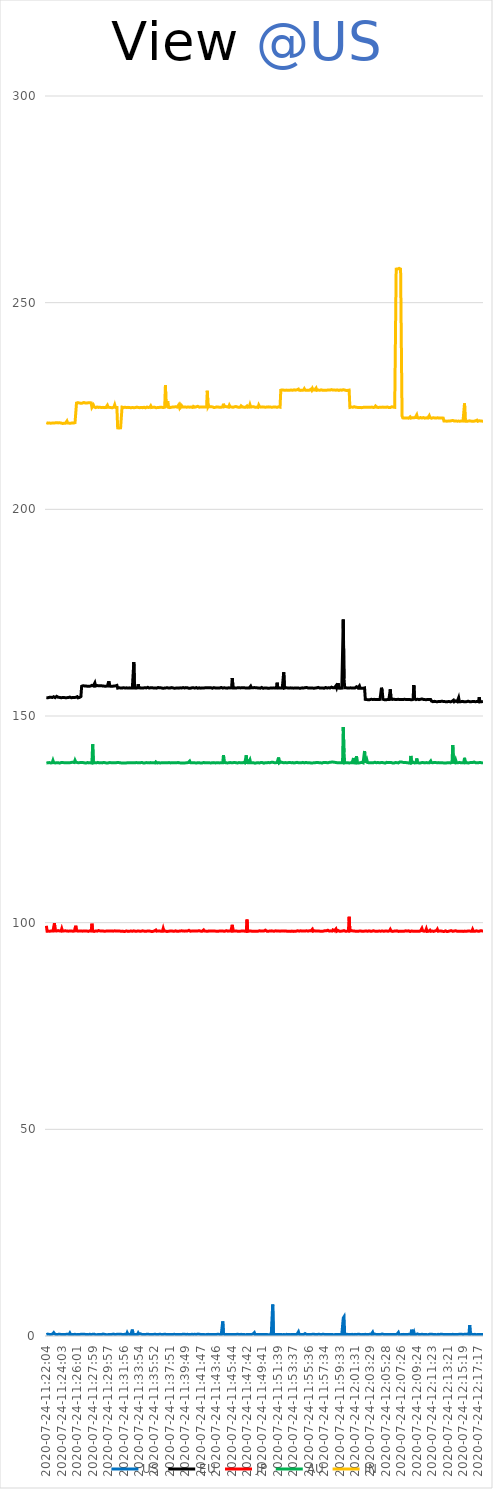
| Category | US | EU | JP | AU | IN |
|---|---|---|---|---|---|
| 2020-07-24-11:22:04 | 0.349 | 154.453 | 99.246 | 138.634 | 220.977 |
| 2020-07-24-11:22:10 | 0.363 | 154.489 | 97.929 | 138.702 | 220.959 |
| 2020-07-24-11:22:16 | 0.46 | 154.418 | 97.937 | 138.682 | 220.846 |
| 2020-07-24-11:22:21 | 0.377 | 154.442 | 97.959 | 138.74 | 220.952 |
| 2020-07-24-11:22:27 | 0.387 | 154.512 | 98.002 | 138.739 | 220.884 |
| 2020-07-24-11:22:33 | 0.388 | 154.384 | 97.931 | 138.747 | 220.794 |
| 2020-07-24-11:22:38 | 0.368 | 154.549 | 98.042 | 138.629 | 220.835 |
| 2020-07-24-11:22:44 | 0.367 | 154.477 | 98.009 | 138.742 | 220.919 |
| 2020-07-24-11:22:49 | 0.422 | 154.471 | 98.019 | 138.701 | 220.879 |
| 2020-07-24-11:22:55 | 0.405 | 154.521 | 97.977 | 139.25 | 220.852 |
| 2020-07-24-11:23:01 | 0.804 | 154.658 | 98.001 | 138.717 | 220.864 |
| 2020-07-24-11:23:06 | 0.53 | 154.465 | 99.886 | 138.709 | 220.865 |
| 2020-07-24-11:23:12 | 0.377 | 154.448 | 98.024 | 138.645 | 220.923 |
| 2020-07-24-11:23:18 | 0.355 | 154.498 | 98.003 | 138.686 | 220.886 |
| 2020-07-24-11:23:23 | 0.393 | 154.749 | 97.991 | 138.7 | 220.935 |
| 2020-07-24-11:23:29 | 0.378 | 154.52 | 97.99 | 138.749 | 220.854 |
| 2020-07-24-11:23:34 | 0.432 | 154.535 | 98.079 | 138.709 | 220.914 |
| 2020-07-24-11:23:40 | 0.405 | 154.465 | 98 | 138.705 | 220.838 |
| 2020-07-24-11:23:46 | 0.399 | 154.496 | 97.999 | 138.609 | 220.935 |
| 2020-07-24-11:23:51 | 0.393 | 154.448 | 98.065 | 138.748 | 221.072 |
| 2020-07-24-11:23:57 | 0.327 | 154.421 | 97.954 | 138.732 | 220.886 |
| 2020-07-24-11:24:03 | 0.354 | 154.458 | 98.548 | 138.692 | 220.937 |
| 2020-07-24-11:24:08 | 0.366 | 154.463 | 97.998 | 138.745 | 220.765 |
| 2020-07-24-11:24:14 | 0.379 | 154.463 | 98.056 | 138.642 | 220.831 |
| 2020-07-24-11:24:19 | 0.408 | 154.455 | 98 | 138.705 | 220.819 |
| 2020-07-24-11:24:25 | 0.355 | 154.453 | 97.985 | 138.658 | 220.846 |
| 2020-07-24-11:24:31 | 0.32 | 154.436 | 98.039 | 138.704 | 220.844 |
| 2020-07-24-11:24:36 | 0.409 | 154.469 | 97.935 | 138.691 | 220.828 |
| 2020-07-24-11:24:42 | 0.335 | 154.441 | 97.963 | 138.696 | 221.373 |
| 2020-07-24-11:24:48 | 0.409 | 154.39 | 97.999 | 138.768 | 220.897 |
| 2020-07-24-11:24:53 | 0.34 | 154.458 | 97.947 | 138.677 | 220.846 |
| 2020-07-24-11:24:59 | 0.376 | 154.435 | 98.024 | 138.733 | 220.841 |
| 2020-07-24-11:25:04 | 0.699 | 154.575 | 97.994 | 138.699 | 220.91 |
| 2020-07-24-11:25:10 | 0.351 | 154.518 | 97.98 | 138.704 | 220.83 |
| 2020-07-24-11:25:16 | 0.341 | 154.422 | 97.987 | 138.774 | 220.953 |
| 2020-07-24-11:25:21 | 0.366 | 154.471 | 97.917 | 138.707 | 220.916 |
| 2020-07-24-11:25:27 | 0.399 | 154.463 | 97.936 | 138.807 | 220.852 |
| 2020-07-24-11:25:33 | 0.358 | 154.501 | 97.966 | 138.764 | 220.875 |
| 2020-07-24-11:25:38 | 0.443 | 154.45 | 97.97 | 138.737 | 220.822 |
| 2020-07-24-11:25:44 | 0.418 | 154.48 | 98.009 | 139.281 | 220.973 |
| 2020-07-24-11:25:50 | 0.344 | 154.525 | 99.256 | 138.882 | 220.877 |
| 2020-07-24-11:25:55 | 0.322 | 154.413 | 98.032 | 138.741 | 225.71 |
| 2020-07-24-11:26:01 | 0.434 | 154.669 | 98.073 | 138.724 | 225.706 |
| 2020-07-24-11:26:06 | 0.365 | 154.4 | 97.946 | 138.676 | 225.809 |
| 2020-07-24-11:26:12 | 0.375 | 154.438 | 97.993 | 138.707 | 225.801 |
| 2020-07-24-11:26:18 | 0.34 | 154.483 | 97.995 | 138.735 | 225.729 |
| 2020-07-24-11:26:23 | 0.319 | 154.467 | 97.976 | 138.728 | 225.726 |
| 2020-07-24-11:26:29 | 0.428 | 154.696 | 97.999 | 138.653 | 225.661 |
| 2020-07-24-11:26:35 | 0.361 | 157.193 | 97.951 | 138.743 | 225.731 |
| 2020-07-24-11:26:40 | 0.404 | 157.238 | 97.947 | 138.779 | 225.696 |
| 2020-07-24-11:26:46 | 0.359 | 157.316 | 97.972 | 138.736 | 225.842 |
| 2020-07-24-11:26:51 | 0.437 | 157.209 | 97.99 | 138.708 | 225.855 |
| 2020-07-24-11:26:57 | 0.328 | 157.273 | 98.024 | 138.66 | 225.696 |
| 2020-07-24-11:27:03 | 0.385 | 157.248 | 97.982 | 138.76 | 225.735 |
| 2020-07-24-11:27:08 | 0.346 | 157.241 | 97.974 | 138.627 | 225.821 |
| 2020-07-24-11:27:14 | 0.385 | 157.196 | 97.995 | 138.844 | 225.707 |
| 2020-07-24-11:27:20 | 0.378 | 157.201 | 97.976 | 138.745 | 225.816 |
| 2020-07-24-11:27:25 | 0.32 | 157.308 | 97.888 | 138.702 | 225.792 |
| 2020-07-24-11:27:31 | 0.402 | 157.174 | 97.987 | 138.66 | 225.793 |
| 2020-07-24-11:27:37 | 0.42 | 157.215 | 98.029 | 138.76 | 225.815 |
| 2020-07-24-11:27:42 | 0.37 | 157.238 | 97.932 | 138.678 | 225.77 |
| 2020-07-24-11:27:48 | 0.342 | 157.349 | 97.974 | 138.694 | 225.754 |
| 2020-07-24-11:27:53 | 0.382 | 157.41 | 99.749 | 138.612 | 224.658 |
| 2020-07-24-11:27:59 | 0.422 | 157.315 | 98.034 | 143.172 | 224.768 |
| 2020-07-24-11:28:05 | 0.39 | 157.271 | 98.058 | 138.718 | 225.225 |
| 2020-07-24-11:28:10 | 0.451 | 157.265 | 97.876 | 138.804 | 224.795 |
| 2020-07-24-11:28:16 | 0.368 | 158.012 | 98.001 | 138.701 | 224.661 |
| 2020-07-24-11:28:22 | 0.306 | 157.251 | 98.002 | 138.746 | 224.615 |
| 2020-07-24-11:28:27 | 0.406 | 157.229 | 98.042 | 138.658 | 224.635 |
| 2020-07-24-11:28:33 | 0.322 | 157.369 | 97.951 | 138.654 | 224.752 |
| 2020-07-24-11:28:39 | 0.412 | 157.295 | 98.035 | 138.774 | 224.677 |
| 2020-07-24-11:28:44 | 0.366 | 157.308 | 98.091 | 138.671 | 224.663 |
| 2020-07-24-11:28:50 | 0.383 | 157.305 | 97.955 | 138.661 | 224.679 |
| 2020-07-24-11:28:55 | 0.366 | 157.34 | 98.009 | 138.719 | 224.682 |
| 2020-07-24-11:29:01 | 0.409 | 157.279 | 97.982 | 138.705 | 224.697 |
| 2020-07-24-11:29:07 | 0.33 | 157.311 | 98.012 | 138.772 | 224.643 |
| 2020-07-24-11:29:12 | 0.336 | 157.206 | 97.999 | 138.655 | 224.625 |
| 2020-07-24-11:29:18 | 0.474 | 157.25 | 97.983 | 138.639 | 224.672 |
| 2020-07-24-11:29:24 | 0.404 | 157.322 | 97.95 | 138.763 | 224.75 |
| 2020-07-24-11:29:29 | 0.4 | 157.225 | 97.908 | 138.656 | 224.606 |
| 2020-07-24-11:29:35 | 0.338 | 157.339 | 98.048 | 138.701 | 224.666 |
| 2020-07-24-11:29:41 | 0.339 | 157.217 | 97.958 | 138.749 | 224.632 |
| 2020-07-24-11:29:46 | 0.31 | 157.34 | 97.95 | 138.614 | 224.608 |
| 2020-07-24-11:29:52 | 0.311 | 157.24 | 97.977 | 138.738 | 225.169 |
| 2020-07-24-11:29:57 | 0.342 | 157.212 | 98.103 | 138.65 | 224.67 |
| 2020-07-24-11:30:03 | 0.381 | 158.392 | 97.988 | 138.743 | 224.778 |
| 2020-07-24-11:30:09 | 0.391 | 157.236 | 98.015 | 138.729 | 224.673 |
| 2020-07-24-11:30:14 | 0.366 | 157.208 | 97.962 | 138.766 | 224.656 |
| 2020-07-24-11:30:20 | 0.361 | 157.195 | 97.872 | 138.714 | 224.612 |
| 2020-07-24-11:30:26 | 0.378 | 157.3 | 97.987 | 138.739 | 224.577 |
| 2020-07-24-11:30:31 | 0.442 | 157.213 | 97.921 | 138.694 | 224.58 |
| 2020-07-24-11:30:37 | 0.461 | 157.31 | 97.944 | 138.836 | 224.632 |
| 2020-07-24-11:30:43 | 0.381 | 157.237 | 97.94 | 138.694 | 224.79 |
| 2020-07-24-11:30:48 | 0.383 | 157.2 | 98.03 | 138.712 | 225.292 |
| 2020-07-24-11:30:54 | 0.368 | 157.294 | 97.93 | 138.661 | 224.662 |
| 2020-07-24-11:30:59 | 0.388 | 157.29 | 97.972 | 138.674 | 224.67 |
| 2020-07-24-11:31:05 | 0.404 | 157.409 | 97.989 | 138.731 | 224.635 |
| 2020-07-24-11:31:11 | 0.444 | 156.751 | 97.964 | 138.698 | 219.707 |
| 2020-07-24-11:31:16 | 0.338 | 156.759 | 97.935 | 138.739 | 219.646 |
| 2020-07-24-11:31:22 | 0.389 | 156.842 | 97.999 | 138.7 | 219.685 |
| 2020-07-24-11:31:28 | 0.365 | 156.773 | 97.939 | 138.703 | 219.825 |
| 2020-07-24-11:31:33 | 0.43 | 156.775 | 97.935 | 138.744 | 219.716 |
| 2020-07-24-11:31:39 | 0.34 | 156.8 | 98.053 | 138.64 | 219.704 |
| 2020-07-24-11:31:44 | 0.373 | 156.753 | 97.953 | 138.678 | 224.728 |
| 2020-07-24-11:31:50 | 0.357 | 156.698 | 97.917 | 138.653 | 224.655 |
| 2020-07-24-11:31:56 | 0.341 | 156.852 | 97.893 | 138.664 | 224.632 |
| 2020-07-24-11:32:01 | 0.423 | 156.821 | 97.94 | 138.652 | 224.714 |
| 2020-07-24-11:32:07 | 0.42 | 156.771 | 97.892 | 138.697 | 224.692 |
| 2020-07-24-11:32:13 | 0.369 | 156.701 | 98 | 138.614 | 224.619 |
| 2020-07-24-11:32:18 | 0.298 | 156.814 | 98.005 | 138.61 | 224.637 |
| 2020-07-24-11:32:24 | 0.785 | 156.777 | 98.212 | 138.695 | 224.609 |
| 2020-07-24-11:32:30 | 0.423 | 156.753 | 97.888 | 138.658 | 224.673 |
| 2020-07-24-11:32:35 | 0.419 | 156.815 | 97.989 | 138.712 | 224.66 |
| 2020-07-24-11:32:41 | 0.375 | 156.808 | 97.93 | 138.684 | 224.639 |
| 2020-07-24-11:32:46 | 0.467 | 156.837 | 97.932 | 138.711 | 224.788 |
| 2020-07-24-11:32:52 | 0.369 | 156.771 | 97.975 | 138.683 | 224.575 |
| 2020-07-24-11:32:58 | 0.337 | 156.73 | 97.852 | 138.697 | 224.673 |
| 2020-07-24-11:33:03 | 1.555 | 156.791 | 97.93 | 138.717 | 224.643 |
| 2020-07-24-11:33:09 | 0.345 | 156.785 | 97.873 | 138.67 | 224.687 |
| 2020-07-24-11:33:15 | 0.366 | 163.042 | 98.018 | 138.664 | 224.591 |
| 2020-07-24-11:33:20 | 0.354 | 156.781 | 97.963 | 138.665 | 224.585 |
| 2020-07-24-11:33:26 | 0.345 | 156.818 | 97.936 | 138.72 | 224.616 |
| 2020-07-24-11:33:32 | 0.37 | 156.734 | 97.96 | 138.727 | 224.786 |
| 2020-07-24-11:33:37 | 0.352 | 156.777 | 97.937 | 138.745 | 224.722 |
| 2020-07-24-11:33:43 | 0.357 | 156.824 | 97.986 | 138.71 | 224.856 |
| 2020-07-24-11:33:48 | 0.74 | 157.667 | 97.988 | 138.673 | 224.652 |
| 2020-07-24-11:33:54 | 0.455 | 156.818 | 98.003 | 138.682 | 224.733 |
| 2020-07-24-11:34:00 | 0.432 | 156.796 | 97.943 | 138.691 | 224.591 |
| 2020-07-24-11:34:05 | 0.526 | 156.788 | 97.888 | 138.703 | 224.623 |
| 2020-07-24-11:34:11 | 0.627 | 156.987 | 97.94 | 138.688 | 224.65 |
| 2020-07-24-11:34:17 | 0.381 | 156.777 | 97.926 | 138.768 | 224.687 |
| 2020-07-24-11:34:22 | 0.364 | 156.765 | 98.026 | 138.696 | 224.596 |
| 2020-07-24-11:34:28 | 0.386 | 156.786 | 97.922 | 138.631 | 224.674 |
| 2020-07-24-11:34:33 | 0.365 | 156.793 | 97.954 | 138.719 | 224.694 |
| 2020-07-24-11:34:39 | 0.348 | 156.832 | 97.857 | 138.65 | 224.655 |
| 2020-07-24-11:34:45 | 0.312 | 156.762 | 97.923 | 138.713 | 224.557 |
| 2020-07-24-11:34:50 | 0.404 | 156.79 | 97.981 | 138.726 | 224.694 |
| 2020-07-24-11:34:56 | 0.372 | 156.795 | 97.957 | 138.689 | 224.754 |
| 2020-07-24-11:35:02 | 0.426 | 156.944 | 97.949 | 138.706 | 224.718 |
| 2020-07-24-11:35:07 | 0.359 | 156.794 | 98 | 138.67 | 224.624 |
| 2020-07-24-11:35:13 | 0.377 | 156.766 | 97.962 | 138.658 | 224.686 |
| 2020-07-24-11:35:19 | 0.371 | 156.741 | 97.948 | 138.736 | 224.721 |
| 2020-07-24-11:35:24 | 0.389 | 156.825 | 97.924 | 138.729 | 225.014 |
| 2020-07-24-11:35:30 | 0.596 | 156.814 | 97.879 | 138.684 | 224.631 |
| 2020-07-24-11:35:35 | 0.355 | 156.832 | 97.908 | 138.666 | 224.715 |
| 2020-07-24-11:35:41 | 0.373 | 156.765 | 97.893 | 138.699 | 224.693 |
| 2020-07-24-11:35:47 | 0.389 | 156.769 | 97.981 | 138.703 | 224.636 |
| 2020-07-24-11:35:52 | 0.413 | 156.803 | 97.997 | 138.762 | 224.724 |
| 2020-07-24-11:35:58 | 0.429 | 156.784 | 97.999 | 138.64 | 224.676 |
| 2020-07-24-11:36:04 | 0.4 | 156.788 | 98.217 | 138.894 | 224.59 |
| 2020-07-24-11:36:09 | 0.333 | 156.745 | 97.95 | 138.666 | 224.716 |
| 2020-07-24-11:36:15 | 0.351 | 156.8 | 97.992 | 138.624 | 224.612 |
| 2020-07-24-11:36:21 | 0.354 | 156.891 | 97.961 | 138.664 | 224.635 |
| 2020-07-24-11:36:26 | 0.345 | 156.905 | 97.973 | 138.717 | 224.641 |
| 2020-07-24-11:36:32 | 0.429 | 156.805 | 98.011 | 138.749 | 224.684 |
| 2020-07-24-11:36:37 | 0.365 | 156.775 | 98.078 | 138.629 | 224.713 |
| 2020-07-24-11:36:43 | 0.394 | 156.806 | 97.914 | 138.656 | 224.753 |
| 2020-07-24-11:36:49 | 0.398 | 156.766 | 97.944 | 138.698 | 224.701 |
| 2020-07-24-11:36:54 | 0.336 | 156.736 | 97.936 | 138.679 | 224.652 |
| 2020-07-24-11:37:00 | 0.363 | 156.79 | 98.587 | 138.672 | 224.62 |
| 2020-07-24-11:37:06 | 0.408 | 156.739 | 97.975 | 138.72 | 224.642 |
| 2020-07-24-11:37:11 | 0.382 | 156.69 | 98.079 | 138.681 | 224.708 |
| 2020-07-24-11:37:17 | 0.409 | 156.793 | 97.992 | 138.644 | 230.01 |
| 2020-07-24-11:37:23 | 0.366 | 156.777 | 97.964 | 138.688 | 224.687 |
| 2020-07-24-11:37:28 | 0.341 | 156.82 | 97.857 | 138.682 | 224.661 |
| 2020-07-24-11:37:34 | 0.33 | 156.79 | 97.954 | 138.673 | 226.184 |
| 2020-07-24-11:37:39 | 0.331 | 156.796 | 97.921 | 138.691 | 224.688 |
| 2020-07-24-11:37:45 | 0.383 | 156.8 | 97.983 | 138.736 | 224.642 |
| 2020-07-24-11:37:51 | 0.374 | 156.755 | 97.97 | 138.749 | 224.614 |
| 2020-07-24-11:37:56 | 0.351 | 156.748 | 97.932 | 138.654 | 224.594 |
| 2020-07-24-11:38:02 | 0.388 | 156.864 | 97.99 | 138.71 | 224.702 |
| 2020-07-24-11:38:08 | 0.315 | 156.759 | 97.918 | 138.67 | 224.755 |
| 2020-07-24-11:38:13 | 0.372 | 156.811 | 97.951 | 138.704 | 224.754 |
| 2020-07-24-11:38:19 | 0.336 | 156.891 | 97.967 | 138.665 | 224.684 |
| 2020-07-24-11:38:24 | 0.406 | 156.721 | 97.932 | 138.595 | 224.776 |
| 2020-07-24-11:38:30 | 0.348 | 156.717 | 97.887 | 138.686 | 224.707 |
| 2020-07-24-11:38:36 | 0.381 | 156.747 | 98.023 | 138.681 | 224.813 |
| 2020-07-24-11:38:41 | 0.381 | 156.771 | 97.992 | 138.662 | 224.728 |
| 2020-07-24-11:38:47 | 0.378 | 156.758 | 97.902 | 138.651 | 224.737 |
| 2020-07-24-11:38:53 | 0.361 | 156.801 | 97.964 | 138.749 | 224.704 |
| 2020-07-24-11:38:58 | 0.355 | 156.741 | 97.937 | 138.692 | 225.24 |
| 2020-07-24-11:39:04 | 0.459 | 156.792 | 97.947 | 138.672 | 224.695 |
| 2020-07-24-11:39:10 | 0.391 | 156.811 | 97.981 | 138.674 | 225.201 |
| 2020-07-24-11:39:15 | 0.353 | 156.812 | 97.899 | 138.641 | 224.79 |
| 2020-07-24-11:39:21 | 0.388 | 156.779 | 98.033 | 138.666 | 225.071 |
| 2020-07-24-11:39:26 | 0.331 | 156.76 | 98.004 | 138.657 | 224.77 |
| 2020-07-24-11:39:32 | 0.401 | 156.879 | 97.987 | 138.754 | 224.879 |
| 2020-07-24-11:39:38 | 0.424 | 156.798 | 97.986 | 138.648 | 224.757 |
| 2020-07-24-11:39:43 | 0.428 | 156.778 | 97.945 | 138.668 | 224.796 |
| 2020-07-24-11:39:49 | 0.436 | 156.788 | 97.97 | 138.653 | 224.755 |
| 2020-07-24-11:39:55 | 0.365 | 156.865 | 98.004 | 138.696 | 224.792 |
| 2020-07-24-11:40:00 | 0.413 | 156.803 | 97.935 | 138.689 | 224.705 |
| 2020-07-24-11:40:06 | 0.418 | 156.828 | 97.989 | 138.741 | 224.725 |
| 2020-07-24-11:40:12 | 0.355 | 156.788 | 97.996 | 138.733 | 224.775 |
| 2020-07-24-11:40:17 | 0.33 | 156.707 | 98.146 | 138.688 | 224.655 |
| 2020-07-24-11:40:23 | 0.393 | 156.794 | 98.03 | 139.097 | 224.711 |
| 2020-07-24-11:40:28 | 0.353 | 156.731 | 97.93 | 138.712 | 224.792 |
| 2020-07-24-11:40:34 | 0.343 | 156.788 | 98.057 | 138.682 | 224.75 |
| 2020-07-24-11:40:40 | 0.407 | 156.81 | 97.969 | 138.667 | 224.706 |
| 2020-07-24-11:40:45 | 0.368 | 156.833 | 97.931 | 138.655 | 224.662 |
| 2020-07-24-11:40:51 | 0.381 | 156.833 | 97.999 | 138.712 | 224.909 |
| 2020-07-24-11:40:57 | 0.387 | 156.841 | 98.059 | 138.747 | 224.692 |
| 2020-07-24-11:41:02 | 0.418 | 156.753 | 97.982 | 138.675 | 224.71 |
| 2020-07-24-11:41:08 | 0.383 | 156.797 | 98.002 | 138.638 | 224.704 |
| 2020-07-24-11:41:14 | 0.349 | 156.871 | 97.989 | 138.619 | 224.813 |
| 2020-07-24-11:41:19 | 0.337 | 156.775 | 97.954 | 138.711 | 224.764 |
| 2020-07-24-11:41:25 | 0.464 | 156.718 | 98.003 | 138.706 | 224.934 |
| 2020-07-24-11:41:30 | 0.347 | 156.758 | 97.962 | 138.706 | 224.864 |
| 2020-07-24-11:41:36 | 0.442 | 156.823 | 98.049 | 138.692 | 224.726 |
| 2020-07-24-11:41:42 | 0.338 | 156.721 | 97.977 | 138.698 | 224.758 |
| 2020-07-24-11:41:47 | 0.354 | 156.737 | 97.952 | 138.628 | 224.729 |
| 2020-07-24-11:41:53 | 0.406 | 156.784 | 98.002 | 138.642 | 224.697 |
| 2020-07-24-11:41:59 | 0.382 | 156.759 | 97.939 | 138.626 | 224.757 |
| 2020-07-24-11:42:04 | 0.36 | 156.815 | 97.91 | 138.7 | 224.704 |
| 2020-07-24-11:42:10 | 0.359 | 156.747 | 98.229 | 138.758 | 224.777 |
| 2020-07-24-11:42:16 | 0.367 | 156.759 | 97.987 | 138.62 | 224.789 |
| 2020-07-24-11:42:21 | 0.322 | 156.831 | 97.97 | 138.672 | 224.753 |
| 2020-07-24-11:42:27 | 0.347 | 156.731 | 97.951 | 138.643 | 224.72 |
| 2020-07-24-11:42:32 | 0.347 | 156.838 | 97.963 | 138.702 | 224.8 |
| 2020-07-24-11:42:38 | 0.439 | 156.764 | 97.901 | 138.715 | 228.686 |
| 2020-07-24-11:42:44 | 0.402 | 156.819 | 97.931 | 138.695 | 224.779 |
| 2020-07-24-11:42:49 | 0.41 | 156.775 | 97.985 | 138.713 | 225.077 |
| 2020-07-24-11:42:55 | 0.346 | 156.842 | 97.922 | 138.67 | 224.797 |
| 2020-07-24-11:43:01 | 0.35 | 156.79 | 97.963 | 138.703 | 224.734 |
| 2020-07-24-11:43:06 | 0.388 | 156.827 | 97.916 | 138.637 | 224.8 |
| 2020-07-24-11:43:12 | 0.3 | 156.803 | 97.99 | 138.736 | 224.802 |
| 2020-07-24-11:43:17 | 0.341 | 156.727 | 97.924 | 138.707 | 224.787 |
| 2020-07-24-11:43:23 | 0.341 | 156.88 | 97.957 | 138.723 | 224.676 |
| 2020-07-24-11:43:29 | 0.383 | 156.858 | 97.942 | 138.72 | 224.641 |
| 2020-07-24-11:43:34 | 0.379 | 156.733 | 97.968 | 138.715 | 224.696 |
| 2020-07-24-11:43:40 | 0.358 | 156.784 | 97.946 | 138.642 | 224.676 |
| 2020-07-24-11:43:46 | 0.379 | 156.802 | 97.944 | 138.669 | 224.808 |
| 2020-07-24-11:43:51 | 0.393 | 156.773 | 97.968 | 138.689 | 224.788 |
| 2020-07-24-11:43:57 | 0.323 | 156.82 | 97.938 | 138.661 | 224.731 |
| 2020-07-24-11:44:03 | 0.4 | 156.757 | 97.923 | 138.685 | 224.74 |
| 2020-07-24-11:44:08 | 0.357 | 156.784 | 97.955 | 138.666 | 224.675 |
| 2020-07-24-11:44:14 | 0.386 | 156.788 | 97.956 | 138.652 | 224.689 |
| 2020-07-24-11:44:19 | 0.347 | 156.981 | 97.989 | 138.684 | 224.693 |
| 2020-07-24-11:44:25 | 0.368 | 156.903 | 97.972 | 138.699 | 224.706 |
| 2020-07-24-11:44:31 | 0.364 | 156.793 | 98.001 | 138.672 | 224.818 |
| 2020-07-24-11:44:36 | 3.532 | 156.751 | 97.986 | 138.7 | 224.801 |
| 2020-07-24-11:44:42 | 0.448 | 156.801 | 97.952 | 140.533 | 225.539 |
| 2020-07-24-11:44:48 | 0.381 | 156.838 | 97.963 | 138.731 | 224.81 |
| 2020-07-24-11:44:53 | 0.341 | 156.719 | 97.941 | 138.664 | 224.705 |
| 2020-07-24-11:44:59 | 0.356 | 156.761 | 98.033 | 138.699 | 224.869 |
| 2020-07-24-11:45:05 | 0.393 | 156.778 | 98.059 | 138.656 | 225.088 |
| 2020-07-24-11:45:10 | 0.401 | 156.738 | 98.03 | 138.653 | 224.808 |
| 2020-07-24-11:45:16 | 0.337 | 156.708 | 97.947 | 138.705 | 224.759 |
| 2020-07-24-11:45:21 | 0.452 | 156.821 | 97.885 | 138.664 | 224.71 |
| 2020-07-24-11:45:27 | 0.351 | 156.744 | 97.997 | 138.686 | 225.17 |
| 2020-07-24-11:45:33 | 0.344 | 156.791 | 98 | 138.739 | 224.804 |
| 2020-07-24-11:45:38 | 0.343 | 156.771 | 97.963 | 138.597 | 224.625 |
| 2020-07-24-11:45:44 | 0.309 | 156.846 | 97.985 | 138.689 | 224.774 |
| 2020-07-24-11:45:50 | 0.333 | 159.193 | 99.483 | 138.652 | 224.783 |
| 2020-07-24-11:45:55 | 0.349 | 156.797 | 97.939 | 138.709 | 224.686 |
| 2020-07-24-11:46:01 | 0.364 | 156.791 | 97.993 | 138.846 | 224.83 |
| 2020-07-24-11:46:07 | 0.35 | 156.781 | 97.996 | 138.752 | 224.818 |
| 2020-07-24-11:46:12 | 0.336 | 156.798 | 97.95 | 138.768 | 224.7 |
| 2020-07-24-11:46:18 | 0.359 | 156.795 | 97.976 | 138.693 | 224.868 |
| 2020-07-24-11:46:23 | 0.4 | 156.824 | 98.048 | 138.709 | 224.857 |
| 2020-07-24-11:46:29 | 0.348 | 156.809 | 97.946 | 138.633 | 224.752 |
| 2020-07-24-11:46:35 | 0.397 | 156.804 | 98.005 | 138.694 | 224.709 |
| 2020-07-24-11:46:40 | 0.392 | 156.826 | 97.897 | 138.728 | 224.673 |
| 2020-07-24-11:46:46 | 0.361 | 156.797 | 97.991 | 138.715 | 224.743 |
| 2020-07-24-11:46:52 | 0.364 | 156.795 | 97.95 | 138.708 | 224.726 |
| 2020-07-24-11:46:57 | 0.401 | 156.751 | 98.007 | 138.771 | 225.031 |
| 2020-07-24-11:47:03 | 0.401 | 156.849 | 97.964 | 138.687 | 224.88 |
| 2020-07-24-11:47:08 | 0.336 | 156.739 | 97.952 | 138.671 | 224.74 |
| 2020-07-24-11:47:14 | 0.302 | 156.808 | 97.981 | 138.736 | 224.721 |
| 2020-07-24-11:47:20 | 0.347 | 156.765 | 97.968 | 138.706 | 224.722 |
| 2020-07-24-11:47:25 | 0.372 | 156.809 | 97.945 | 138.64 | 224.795 |
| 2020-07-24-11:47:31 | 0.325 | 156.87 | 97.979 | 138.658 | 224.701 |
| 2020-07-24-11:47:37 | 0.456 | 156.762 | 97.889 | 140.486 | 224.727 |
| 2020-07-24-11:47:42 | 0.344 | 156.779 | 100.755 | 138.721 | 224.999 |
| 2020-07-24-11:47:48 | 0.381 | 156.801 | 97.937 | 138.749 | 224.716 |
| 2020-07-24-11:47:54 | 0.371 | 156.72 | 97.952 | 138.693 | 224.711 |
| 2020-07-24-11:47:59 | 0.361 | 156.765 | 97.953 | 138.713 | 224.749 |
| 2020-07-24-11:48:05 | 0.343 | 156.81 | 97.981 | 139.41 | 225.316 |
| 2020-07-24-11:48:10 | 0.394 | 157.218 | 97.99 | 138.686 | 224.749 |
| 2020-07-24-11:48:16 | 0.359 | 156.813 | 97.976 | 138.693 | 224.787 |
| 2020-07-24-11:48:22 | 0.36 | 156.781 | 97.912 | 138.683 | 224.794 |
| 2020-07-24-11:48:27 | 0.466 | 156.844 | 97.993 | 138.727 | 224.751 |
| 2020-07-24-11:48:33 | 0.417 | 156.807 | 97.942 | 138.679 | 224.83 |
| 2020-07-24-11:48:39 | 0.801 | 156.874 | 97.989 | 138.729 | 224.702 |
| 2020-07-24-11:48:44 | 0.349 | 156.732 | 97.929 | 138.579 | 224.695 |
| 2020-07-24-11:48:50 | 0.349 | 156.819 | 97.98 | 138.69 | 224.695 |
| 2020-07-24-11:48:56 | 0.351 | 156.733 | 97.92 | 138.668 | 224.735 |
| 2020-07-24-11:49:01 | 0.429 | 156.807 | 97.953 | 138.673 | 224.768 |
| 2020-07-24-11:49:07 | 0.36 | 156.784 | 97.932 | 138.698 | 224.658 |
| 2020-07-24-11:49:12 | 0.384 | 156.775 | 97.992 | 138.644 | 225.222 |
| 2020-07-24-11:49:18 | 0.335 | 156.787 | 98.032 | 138.63 | 224.869 |
| 2020-07-24-11:49:24 | 0.328 | 156.728 | 97.927 | 138.757 | 224.759 |
| 2020-07-24-11:49:29 | 0.336 | 156.746 | 97.99 | 138.769 | 224.726 |
| 2020-07-24-11:49:35 | 0.307 | 156.913 | 97.948 | 138.727 | 224.692 |
| 2020-07-24-11:49:41 | 0.375 | 156.764 | 97.955 | 138.726 | 224.789 |
| 2020-07-24-11:49:46 | 0.363 | 156.708 | 98.006 | 138.718 | 224.716 |
| 2020-07-24-11:49:52 | 0.371 | 156.813 | 97.975 | 138.58 | 224.768 |
| 2020-07-24-11:49:58 | 0.426 | 156.785 | 97.95 | 138.715 | 224.822 |
| 2020-07-24-11:50:03 | 0.383 | 156.933 | 98.185 | 138.699 | 224.693 |
| 2020-07-24-11:50:09 | 0.371 | 156.76 | 97.976 | 138.675 | 224.699 |
| 2020-07-24-11:50:14 | 0.357 | 156.783 | 97.938 | 138.692 | 224.756 |
| 2020-07-24-11:50:20 | 0.401 | 156.74 | 98.022 | 138.694 | 224.777 |
| 2020-07-24-11:50:26 | 0.312 | 156.685 | 97.941 | 138.75 | 224.791 |
| 2020-07-24-11:50:31 | 0.366 | 156.721 | 97.96 | 138.703 | 224.738 |
| 2020-07-24-11:50:37 | 0.338 | 156.771 | 97.966 | 138.685 | 224.742 |
| 2020-07-24-11:50:43 | 0.315 | 156.767 | 97.972 | 138.723 | 224.804 |
| 2020-07-24-11:50:48 | 0.34 | 156.739 | 98.016 | 138.785 | 224.724 |
| 2020-07-24-11:50:54 | 0.291 | 156.79 | 97.952 | 138.711 | 224.807 |
| 2020-07-24-11:51:00 | 7.626 | 156.85 | 97.967 | 138.82 | 224.726 |
| 2020-07-24-11:51:05 | 0.37 | 156.806 | 97.974 | 138.705 | 224.837 |
| 2020-07-24-11:51:11 | 0.345 | 156.745 | 97.929 | 138.716 | 224.778 |
| 2020-07-24-11:51:16 | 0.353 | 156.751 | 97.936 | 138.736 | 224.72 |
| 2020-07-24-11:51:22 | 0.329 | 156.859 | 98.03 | 138.69 | 224.754 |
| 2020-07-24-11:51:28 | 0.363 | 156.818 | 97.943 | 138.746 | 224.779 |
| 2020-07-24-11:51:33 | 0.39 | 158.056 | 97.971 | 138.752 | 224.685 |
| 2020-07-24-11:51:39 | 0.382 | 156.79 | 97.987 | 138.68 | 224.84 |
| 2020-07-24-11:51:45 | 0.383 | 156.793 | 97.98 | 139.958 | 224.809 |
| 2020-07-24-11:51:50 | 0.333 | 156.78 | 97.911 | 138.649 | 224.789 |
| 2020-07-24-11:51:56 | 0.374 | 156.793 | 97.943 | 138.635 | 224.722 |
| 2020-07-24-11:52:02 | 0.378 | 156.747 | 97.953 | 138.89 | 228.815 |
| 2020-07-24-11:52:07 | 0.349 | 156.749 | 97.992 | 138.723 | 228.827 |
| 2020-07-24-11:52:13 | 0.309 | 156.765 | 97.971 | 138.758 | 228.896 |
| 2020-07-24-11:52:18 | 0.347 | 156.739 | 98.01 | 138.729 | 228.801 |
| 2020-07-24-11:52:24 | 0.372 | 160.585 | 97.926 | 138.682 | 228.831 |
| 2020-07-24-11:52:30 | 0.344 | 156.75 | 97.953 | 138.693 | 228.899 |
| 2020-07-24-11:52:35 | 0.295 | 156.75 | 97.917 | 138.736 | 228.799 |
| 2020-07-24-11:52:41 | 0.348 | 156.835 | 97.983 | 138.726 | 228.817 |
| 2020-07-24-11:52:47 | 0.4 | 156.754 | 98.047 | 138.672 | 228.845 |
| 2020-07-24-11:52:52 | 0.364 | 156.801 | 97.904 | 138.687 | 228.815 |
| 2020-07-24-11:52:58 | 0.362 | 156.836 | 98.002 | 138.718 | 228.819 |
| 2020-07-24-11:53:04 | 0.577 | 156.798 | 97.937 | 138.664 | 228.861 |
| 2020-07-24-11:53:09 | 0.349 | 156.727 | 97.908 | 138.757 | 228.812 |
| 2020-07-24-11:53:15 | 0.349 | 156.806 | 97.891 | 138.687 | 228.809 |
| 2020-07-24-11:53:20 | 0.328 | 156.852 | 98.023 | 138.708 | 228.866 |
| 2020-07-24-11:53:26 | 0.416 | 156.765 | 97.964 | 138.641 | 228.753 |
| 2020-07-24-11:53:32 | 0.38 | 156.796 | 97.944 | 138.724 | 228.807 |
| 2020-07-24-11:53:37 | 0.384 | 156.738 | 97.887 | 138.694 | 228.753 |
| 2020-07-24-11:53:43 | 0.335 | 156.768 | 97.909 | 138.643 | 228.912 |
| 2020-07-24-11:53:49 | 0.371 | 156.772 | 97.936 | 138.696 | 228.921 |
| 2020-07-24-11:53:54 | 0.361 | 156.715 | 97.924 | 138.708 | 228.838 |
| 2020-07-24-11:54:00 | 0.371 | 156.781 | 97.949 | 138.704 | 228.91 |
| 2020-07-24-11:54:06 | 0.387 | 156.849 | 97.94 | 138.779 | 228.916 |
| 2020-07-24-11:54:11 | 0.387 | 156.768 | 98.044 | 138.726 | 228.8 |
| 2020-07-24-11:54:17 | 0.997 | 156.751 | 97.946 | 138.69 | 229.1 |
| 2020-07-24-11:54:22 | 0.389 | 156.74 | 97.948 | 138.625 | 228.826 |
| 2020-07-24-11:54:28 | 0.333 | 156.825 | 97.931 | 138.67 | 228.827 |
| 2020-07-24-11:54:34 | 0.365 | 156.735 | 98.029 | 138.738 | 228.778 |
| 2020-07-24-11:54:39 | 0.38 | 156.772 | 97.978 | 138.672 | 228.894 |
| 2020-07-24-11:54:45 | 0.378 | 156.808 | 97.985 | 138.661 | 228.791 |
| 2020-07-24-11:54:51 | 0.373 | 156.749 | 97.909 | 138.776 | 228.839 |
| 2020-07-24-11:54:56 | 0.312 | 156.784 | 98.005 | 138.641 | 228.851 |
| 2020-07-24-11:55:02 | 0.417 | 156.831 | 97.982 | 138.661 | 229.166 |
| 2020-07-24-11:55:08 | 0.578 | 156.835 | 97.973 | 138.778 | 228.841 |
| 2020-07-24-11:55:13 | 0.387 | 156.793 | 97.915 | 138.751 | 228.834 |
| 2020-07-24-11:55:19 | 0.383 | 156.902 | 98.036 | 138.765 | 228.799 |
| 2020-07-24-11:55:24 | 0.377 | 156.73 | 97.994 | 138.705 | 228.872 |
| 2020-07-24-11:55:30 | 0.375 | 156.776 | 97.949 | 138.649 | 228.806 |
| 2020-07-24-11:55:36 | 0.338 | 156.782 | 98.034 | 138.69 | 228.869 |
| 2020-07-24-11:55:41 | 0.339 | 156.782 | 98.051 | 138.706 | 228.835 |
| 2020-07-24-11:55:47 | 0.359 | 156.788 | 98.018 | 138.663 | 228.864 |
| 2020-07-24-11:55:53 | 0.385 | 156.755 | 98.01 | 138.668 | 229.066 |
| 2020-07-24-11:55:58 | 0.359 | 156.747 | 98.013 | 138.629 | 228.796 |
| 2020-07-24-11:56:04 | 0.398 | 156.783 | 98.412 | 138.625 | 229.227 |
| 2020-07-24-11:56:10 | 0.359 | 156.762 | 97.932 | 138.661 | 228.844 |
| 2020-07-24-11:56:15 | 0.433 | 156.704 | 97.915 | 138.767 | 229.033 |
| 2020-07-24-11:56:21 | 0.418 | 156.724 | 98.047 | 138.669 | 228.877 |
| 2020-07-24-11:56:27 | 0.332 | 156.779 | 97.954 | 138.643 | 228.886 |
| 2020-07-24-11:56:32 | 0.392 | 156.74 | 97.958 | 138.737 | 229.328 |
| 2020-07-24-11:56:38 | 0.351 | 156.812 | 97.906 | 138.676 | 228.792 |
| 2020-07-24-11:56:43 | 0.344 | 156.831 | 98.002 | 138.758 | 228.804 |
| 2020-07-24-11:56:49 | 0.413 | 156.916 | 97.949 | 138.632 | 228.872 |
| 2020-07-24-11:56:55 | 0.373 | 156.778 | 97.974 | 138.704 | 228.854 |
| 2020-07-24-11:57:00 | 0.392 | 156.76 | 98.011 | 138.715 | 228.8 |
| 2020-07-24-11:57:06 | 0.376 | 156.806 | 97.927 | 138.698 | 228.754 |
| 2020-07-24-11:57:12 | 0.344 | 156.756 | 97.997 | 138.826 | 228.912 |
| 2020-07-24-11:57:17 | 0.346 | 156.745 | 97.904 | 138.606 | 228.919 |
| 2020-07-24-11:57:23 | 0.423 | 156.788 | 98.049 | 138.662 | 228.81 |
| 2020-07-24-11:57:29 | 0.388 | 156.773 | 97.959 | 138.763 | 228.86 |
| 2020-07-24-11:57:34 | 0.395 | 156.706 | 97.874 | 138.666 | 228.793 |
| 2020-07-24-11:57:40 | 0.496 | 156.846 | 98.062 | 138.726 | 228.849 |
| 2020-07-24-11:57:45 | 0.367 | 156.89 | 97.975 | 138.76 | 228.782 |
| 2020-07-24-11:57:51 | 0.381 | 156.863 | 98.021 | 138.726 | 228.78 |
| 2020-07-24-11:57:57 | 0.346 | 156.775 | 97.883 | 138.754 | 228.836 |
| 2020-07-24-11:58:02 | 0.508 | 156.763 | 98.173 | 138.675 | 228.832 |
| 2020-07-24-11:58:08 | 0.354 | 156.833 | 97.985 | 138.733 | 228.896 |
| 2020-07-24-11:58:14 | 0.365 | 156.811 | 97.963 | 138.776 | 228.935 |
| 2020-07-24-11:58:19 | 0.347 | 156.773 | 97.994 | 138.785 | 228.85 |
| 2020-07-24-11:58:25 | 0.375 | 156.77 | 98.022 | 138.824 | 228.818 |
| 2020-07-24-11:58:31 | 0.387 | 156.983 | 97.921 | 138.726 | 228.96 |
| 2020-07-24-11:58:36 | 0.363 | 156.826 | 97.968 | 138.864 | 228.833 |
| 2020-07-24-11:58:42 | 0.33 | 156.827 | 98.252 | 138.753 | 228.852 |
| 2020-07-24-11:58:47 | 0.359 | 156.834 | 98.15 | 138.832 | 228.841 |
| 2020-07-24-11:58:53 | 0.332 | 156.831 | 98.036 | 138.775 | 228.885 |
| 2020-07-24-11:58:59 | 0.293 | 156.926 | 97.943 | 138.777 | 228.806 |
| 2020-07-24-11:59:04 | 0.362 | 157.294 | 98.471 | 138.779 | 228.822 |
| 2020-07-24-11:59:10 | 0.375 | 156.799 | 97.908 | 138.718 | 228.861 |
| 2020-07-24-11:59:16 | 0.38 | 156.707 | 97.928 | 138.757 | 228.897 |
| 2020-07-24-11:59:21 | 0.431 | 157.929 | 98.117 | 138.661 | 228.87 |
| 2020-07-24-11:59:27 | 0.344 | 156.77 | 97.94 | 138.647 | 228.764 |
| 2020-07-24-11:59:33 | 0.447 | 156.943 | 97.933 | 138.694 | 228.821 |
| 2020-07-24-11:59:38 | 0.361 | 156.731 | 97.953 | 138.717 | 228.886 |
| 2020-07-24-11:59:44 | 0.346 | 156.733 | 97.941 | 138.705 | 228.788 |
| 2020-07-24-11:59:50 | 0.371 | 156.75 | 97.969 | 138.674 | 228.822 |
| 2020-07-24-11:59:55 | 0.376 | 156.841 | 97.982 | 138.708 | 228.737 |
| 2020-07-24-12:00:01 | 4.347 | 173.355 | 97.99 | 147.325 | 228.94 |
| 2020-07-24-12:00:06 | 4.634 | 159.072 | 98.079 | 141.191 | 228.846 |
| 2020-07-24-12:00:12 | 0.353 | 156.837 | 98.001 | 138.65 | 228.862 |
| 2020-07-24-12:00:18 | 0.341 | 156.824 | 97.924 | 138.696 | 228.833 |
| 2020-07-24-12:00:23 | 0.362 | 156.821 | 97.889 | 138.717 | 228.763 |
| 2020-07-24-12:00:29 | 0.311 | 156.768 | 97.952 | 138.663 | 228.767 |
| 2020-07-24-12:00:35 | 0.398 | 156.755 | 97.953 | 138.69 | 228.778 |
| 2020-07-24-12:00:40 | 0.362 | 156.752 | 97.964 | 138.661 | 228.786 |
| 2020-07-24-12:00:46 | 0.334 | 156.779 | 101.431 | 138.64 | 228.845 |
| 2020-07-24-12:00:52 | 0.319 | 156.757 | 97.981 | 138.657 | 224.661 |
| 2020-07-24-12:00:57 | 0.363 | 156.81 | 98.009 | 138.679 | 224.696 |
| 2020-07-24-12:01:03 | 0.402 | 156.925 | 98.087 | 138.71 | 224.761 |
| 2020-07-24-12:01:09 | 0.403 | 156.787 | 97.974 | 138.683 | 224.812 |
| 2020-07-24-12:01:14 | 0.356 | 156.835 | 98.003 | 138.695 | 224.695 |
| 2020-07-24-12:01:20 | 0.311 | 156.783 | 97.966 | 139.841 | 224.669 |
| 2020-07-24-12:01:25 | 0.327 | 156.713 | 97.983 | 138.659 | 224.824 |
| 2020-07-24-12:01:31 | 0.398 | 156.791 | 97.983 | 138.654 | 224.586 |
| 2020-07-24-12:01:37 | 0.341 | 156.792 | 97.904 | 138.647 | 224.712 |
| 2020-07-24-12:01:42 | 0.369 | 157.068 | 98.037 | 140.307 | 224.64 |
| 2020-07-24-12:01:48 | 0.374 | 156.831 | 97.952 | 138.663 | 224.668 |
| 2020-07-24-12:01:54 | 0.41 | 156.78 | 98.035 | 138.726 | 224.659 |
| 2020-07-24-12:01:59 | 0.315 | 156.758 | 97.946 | 138.624 | 224.627 |
| 2020-07-24-12:02:05 | 0.399 | 157.283 | 98.023 | 138.694 | 224.678 |
| 2020-07-24-12:02:10 | 0.347 | 156.737 | 97.989 | 138.69 | 224.647 |
| 2020-07-24-12:02:16 | 0.327 | 156.759 | 97.956 | 138.649 | 224.656 |
| 2020-07-24-12:02:22 | 0.393 | 156.737 | 97.944 | 138.789 | 224.594 |
| 2020-07-24-12:02:27 | 0.352 | 156.749 | 97.943 | 138.693 | 224.659 |
| 2020-07-24-12:02:33 | 0.333 | 156.712 | 97.935 | 138.669 | 224.67 |
| 2020-07-24-12:02:39 | 0.33 | 156.73 | 97.99 | 138.655 | 224.732 |
| 2020-07-24-12:02:44 | 0.328 | 156.798 | 97.953 | 141.536 | 224.67 |
| 2020-07-24-12:02:50 | 0.413 | 154.022 | 97.985 | 138.658 | 224.603 |
| 2020-07-24-12:02:56 | 0.335 | 153.956 | 97.996 | 138.716 | 224.669 |
| 2020-07-24-12:03:01 | 0.332 | 153.968 | 97.963 | 139.454 | 224.694 |
| 2020-07-24-12:03:07 | 0.397 | 153.971 | 97.919 | 138.763 | 224.681 |
| 2020-07-24-12:03:12 | 0.366 | 153.946 | 97.988 | 138.704 | 224.659 |
| 2020-07-24-12:03:18 | 0.357 | 153.978 | 98.018 | 138.665 | 224.718 |
| 2020-07-24-12:03:24 | 0.416 | 153.95 | 97.923 | 138.682 | 224.566 |
| 2020-07-24-12:03:29 | 0.326 | 154.095 | 97.944 | 138.71 | 224.706 |
| 2020-07-24-12:03:35 | 0.382 | 154.039 | 98.069 | 138.729 | 224.788 |
| 2020-07-24-12:03:41 | 0.412 | 154.215 | 97.938 | 138.694 | 224.737 |
| 2020-07-24-12:03:46 | 0.908 | 154.009 | 97.97 | 138.745 | 224.675 |
| 2020-07-24-12:03:52 | 0.397 | 154.042 | 98.044 | 138.687 | 224.635 |
| 2020-07-24-12:03:58 | 0.443 | 154.026 | 97.94 | 138.693 | 224.669 |
| 2020-07-24-12:04:03 | 0.449 | 154.13 | 97.953 | 138.815 | 224.714 |
| 2020-07-24-12:04:09 | 0.368 | 153.996 | 97.981 | 138.754 | 225.002 |
| 2020-07-24-12:04:14 | 0.373 | 154.07 | 97.919 | 138.69 | 224.871 |
| 2020-07-24-12:04:20 | 0.392 | 154.017 | 97.913 | 138.731 | 224.674 |
| 2020-07-24-12:04:26 | 0.331 | 154.059 | 97.936 | 138.744 | 224.701 |
| 2020-07-24-12:04:31 | 0.346 | 153.99 | 97.939 | 138.751 | 224.654 |
| 2020-07-24-12:04:37 | 0.357 | 154.009 | 97.97 | 138.694 | 224.605 |
| 2020-07-24-12:04:43 | 0.337 | 154.02 | 98.02 | 138.65 | 224.724 |
| 2020-07-24-12:04:48 | 0.364 | 153.964 | 97.936 | 138.722 | 224.605 |
| 2020-07-24-12:04:54 | 0.354 | 156.842 | 97.923 | 138.707 | 224.704 |
| 2020-07-24-12:04:59 | 0.485 | 156.05 | 98.006 | 138.753 | 224.671 |
| 2020-07-24-12:05:05 | 0.388 | 154.043 | 98.024 | 138.692 | 224.733 |
| 2020-07-24-12:05:11 | 0.375 | 154.025 | 97.922 | 138.684 | 224.684 |
| 2020-07-24-12:05:16 | 0.439 | 153.942 | 97.941 | 138.667 | 224.67 |
| 2020-07-24-12:05:22 | 0.342 | 153.988 | 97.975 | 138.61 | 224.702 |
| 2020-07-24-12:05:28 | 0.416 | 153.959 | 97.918 | 138.708 | 224.674 |
| 2020-07-24-12:05:33 | 0.361 | 153.953 | 97.998 | 138.785 | 224.765 |
| 2020-07-24-12:05:39 | 0.336 | 153.962 | 97.942 | 138.66 | 224.766 |
| 2020-07-24-12:05:45 | 0.374 | 153.933 | 97.909 | 138.722 | 224.708 |
| 2020-07-24-12:05:50 | 0.312 | 153.97 | 97.967 | 138.669 | 224.623 |
| 2020-07-24-12:05:56 | 0.376 | 154.068 | 98.04 | 138.773 | 224.74 |
| 2020-07-24-12:06:01 | 0.442 | 156.443 | 98.354 | 138.667 | 224.636 |
| 2020-07-24-12:06:07 | 0.348 | 154.036 | 97.993 | 138.759 | 224.671 |
| 2020-07-24-12:06:13 | 0.359 | 154.03 | 97.914 | 138.677 | 224.822 |
| 2020-07-24-12:06:18 | 0.374 | 154.017 | 97.888 | 138.641 | 224.624 |
| 2020-07-24-12:06:24 | 0.345 | 153.961 | 97.917 | 138.648 | 224.731 |
| 2020-07-24-12:06:30 | 0.367 | 154.061 | 97.951 | 138.616 | 224.742 |
| 2020-07-24-12:06:35 | 0.344 | 153.97 | 97.983 | 138.764 | 224.677 |
| 2020-07-24-12:06:41 | 0.386 | 153.968 | 97.977 | 138.748 | 224.8 |
| 2020-07-24-12:06:46 | 0.324 | 153.958 | 98.022 | 138.665 | 258.115 |
| 2020-07-24-12:06:52 | 0.394 | 154.016 | 98.024 | 138.707 | 258.175 |
| 2020-07-24-12:06:58 | 0.399 | 154.003 | 97.944 | 138.735 | 258.141 |
| 2020-07-24-12:07:03 | 0.852 | 154.029 | 97.887 | 138.646 | 258.196 |
| 2020-07-24-12:07:09 | 0.352 | 153.985 | 98.05 | 138.753 | 258.292 |
| 2020-07-24-12:07:15 | 0.408 | 153.978 | 97.948 | 138.89 | 258.103 |
| 2020-07-24-12:07:20 | 0.321 | 153.923 | 98.011 | 138.742 | 258.138 |
| 2020-07-24-12:07:26 | 0.42 | 153.994 | 97.936 | 138.885 | 258.149 |
| 2020-07-24-12:07:32 | 0.371 | 154.067 | 98.036 | 138.81 | 222.599 |
| 2020-07-24-12:07:37 | 0.337 | 153.967 | 97.925 | 138.786 | 222.121 |
| 2020-07-24-12:07:43 | 0.394 | 154.001 | 97.974 | 138.8 | 222.144 |
| 2020-07-24-12:07:49 | 0.36 | 154.037 | 97.935 | 138.739 | 222.098 |
| 2020-07-24-12:07:54 | 0.376 | 153.996 | 97.997 | 138.791 | 222.112 |
| 2020-07-24-12:08:00 | 0.389 | 154.014 | 98.026 | 138.733 | 222.066 |
| 2020-07-24-12:08:06 | 0.371 | 154 | 97.935 | 138.751 | 222.124 |
| 2020-07-24-12:08:11 | 0.401 | 154.001 | 97.985 | 138.703 | 222.088 |
| 2020-07-24-12:08:17 | 0.375 | 153.945 | 98.015 | 138.79 | 222.072 |
| 2020-07-24-12:08:22 | 0.351 | 153.99 | 98.02 | 138.64 | 222.053 |
| 2020-07-24-12:08:28 | 0.435 | 154.172 | 98.062 | 138.71 | 222.09 |
| 2020-07-24-12:08:34 | 0.365 | 153.966 | 97.871 | 138.649 | 222.37 |
| 2020-07-24-12:08:39 | 0.325 | 153.916 | 97.985 | 140.335 | 222.068 |
| 2020-07-24-12:08:45 | 1.526 | 153.923 | 97.984 | 138.664 | 222.086 |
| 2020-07-24-12:08:51 | 0.415 | 154.002 | 98.012 | 138.647 | 222.157 |
| 2020-07-24-12:08:56 | 0.402 | 154.002 | 97.929 | 138.835 | 222.159 |
| 2020-07-24-12:09:02 | 1.027 | 157.506 | 97.98 | 138.693 | 222.154 |
| 2020-07-24-12:09:07 | 0.297 | 154.222 | 97.913 | 138.637 | 222.111 |
| 2020-07-24-12:09:13 | 0.468 | 154.224 | 97.926 | 138.662 | 222.215 |
| 2020-07-24-12:09:19 | 0.36 | 153.958 | 97.893 | 138.687 | 222.093 |
| 2020-07-24-12:09:24 | 0.331 | 154.043 | 97.936 | 139.731 | 222.854 |
| 2020-07-24-12:09:30 | 0.504 | 154.065 | 97.93 | 138.715 | 222.171 |
| 2020-07-24-12:09:36 | 0.347 | 153.95 | 97.984 | 138.689 | 222.22 |
| 2020-07-24-12:09:41 | 0.335 | 153.961 | 97.905 | 138.643 | 222.07 |
| 2020-07-24-12:09:47 | 0.337 | 153.965 | 97.965 | 138.717 | 222.132 |
| 2020-07-24-12:09:53 | 0.364 | 154.053 | 97.985 | 138.652 | 222.205 |
| 2020-07-24-12:09:58 | 0.396 | 153.985 | 97.864 | 138.673 | 222.108 |
| 2020-07-24-12:10:04 | 0.408 | 154.121 | 98.617 | 138.737 | 222.096 |
| 2020-07-24-12:10:09 | 0.44 | 153.996 | 98.048 | 138.717 | 222.118 |
| 2020-07-24-12:10:15 | 0.377 | 154.011 | 97.89 | 138.724 | 222.199 |
| 2020-07-24-12:10:21 | 0.47 | 154.063 | 97.933 | 138.744 | 222.131 |
| 2020-07-24-12:10:26 | 0.339 | 153.966 | 97.922 | 138.66 | 222.065 |
| 2020-07-24-12:10:32 | 0.365 | 153.964 | 98.009 | 138.64 | 222.181 |
| 2020-07-24-12:10:38 | 0.342 | 153.951 | 98.486 | 138.729 | 222.137 |
| 2020-07-24-12:10:43 | 0.373 | 153.934 | 97.886 | 138.691 | 222.025 |
| 2020-07-24-12:10:49 | 0.318 | 154.015 | 98.006 | 138.697 | 222.079 |
| 2020-07-24-12:10:54 | 0.376 | 153.91 | 97.906 | 138.64 | 222.153 |
| 2020-07-24-12:11:00 | 0.394 | 154.021 | 98.039 | 138.67 | 222.661 |
| 2020-07-24-12:11:06 | 0.427 | 154.021 | 98.186 | 138.654 | 222.176 |
| 2020-07-24-12:11:11 | 0.434 | 153.981 | 97.915 | 139.124 | 222.162 |
| 2020-07-24-12:11:17 | 0.332 | 153.615 | 98.042 | 138.724 | 222.049 |
| 2020-07-24-12:11:23 | 0.412 | 153.462 | 97.983 | 138.756 | 222.143 |
| 2020-07-24-12:11:28 | 0.388 | 153.462 | 97.96 | 138.705 | 222.149 |
| 2020-07-24-12:11:34 | 0.354 | 153.467 | 97.878 | 138.688 | 222.165 |
| 2020-07-24-12:11:39 | 0.325 | 153.548 | 97.991 | 138.755 | 222.125 |
| 2020-07-24-12:11:45 | 0.354 | 153.465 | 98.014 | 138.685 | 222.204 |
| 2020-07-24-12:11:51 | 0.413 | 153.48 | 97.939 | 138.725 | 222.086 |
| 2020-07-24-12:11:56 | 0.313 | 153.397 | 98.11 | 138.692 | 222.055 |
| 2020-07-24-12:12:02 | 0.42 | 153.449 | 98.397 | 138.703 | 222.131 |
| 2020-07-24-12:12:08 | 0.398 | 153.577 | 97.94 | 138.695 | 222.124 |
| 2020-07-24-12:12:13 | 0.405 | 153.514 | 97.955 | 138.724 | 222.123 |
| 2020-07-24-12:12:19 | 0.373 | 153.45 | 97.98 | 138.773 | 222.146 |
| 2020-07-24-12:12:25 | 0.345 | 153.502 | 97.962 | 138.673 | 222.071 |
| 2020-07-24-12:12:30 | 0.422 | 153.463 | 97.988 | 138.739 | 222.101 |
| 2020-07-24-12:12:36 | 0.366 | 153.59 | 97.96 | 138.661 | 222.122 |
| 2020-07-24-12:12:41 | 0.395 | 153.474 | 97.908 | 138.743 | 222.143 |
| 2020-07-24-12:12:47 | 0.348 | 153.52 | 97.989 | 138.66 | 222.075 |
| 2020-07-24-12:12:53 | 0.379 | 153.488 | 97.866 | 138.704 | 221.364 |
| 2020-07-24-12:12:58 | 0.354 | 153.48 | 97.916 | 138.636 | 221.383 |
| 2020-07-24-12:13:04 | 0.365 | 153.435 | 98.021 | 138.737 | 221.365 |
| 2020-07-24-12:13:10 | 0.35 | 153.469 | 97.943 | 138.639 | 221.375 |
| 2020-07-24-12:13:15 | 0.345 | 153.44 | 97.869 | 138.773 | 221.328 |
| 2020-07-24-12:13:21 | 0.36 | 153.467 | 97.893 | 138.711 | 221.384 |
| 2020-07-24-12:13:26 | 0.371 | 153.559 | 97.896 | 138.66 | 221.359 |
| 2020-07-24-12:13:32 | 0.357 | 153.516 | 97.868 | 138.711 | 221.35 |
| 2020-07-24-12:13:38 | 0.391 | 153.452 | 98 | 138.848 | 221.361 |
| 2020-07-24-12:13:43 | 0.38 | 153.415 | 97.928 | 138.642 | 221.305 |
| 2020-07-24-12:13:49 | 0.321 | 153.409 | 98.067 | 138.7 | 221.429 |
| 2020-07-24-12:13:55 | 0.376 | 153.543 | 97.835 | 138.755 | 221.324 |
| 2020-07-24-12:14:00 | 0.409 | 153.527 | 97.899 | 142.991 | 221.502 |
| 2020-07-24-12:14:06 | 0.385 | 153.824 | 97.95 | 138.807 | 221.359 |
| 2020-07-24-12:14:11 | 0.333 | 153.439 | 97.997 | 138.726 | 221.365 |
| 2020-07-24-12:14:17 | 0.412 | 153.468 | 97.928 | 138.69 | 221.324 |
| 2020-07-24-12:14:23 | 0.361 | 153.64 | 98.04 | 139.297 | 221.371 |
| 2020-07-24-12:14:28 | 0.421 | 153.458 | 97.936 | 138.685 | 221.338 |
| 2020-07-24-12:14:34 | 0.364 | 153.471 | 97.924 | 138.665 | 221.337 |
| 2020-07-24-12:14:40 | 0.347 | 153.437 | 97.931 | 138.671 | 221.298 |
| 2020-07-24-12:14:45 | 0.396 | 154.425 | 97.896 | 138.734 | 221.344 |
| 2020-07-24-12:14:51 | 0.406 | 153.46 | 97.852 | 138.775 | 221.426 |
| 2020-07-24-12:14:56 | 0.406 | 153.538 | 97.923 | 138.702 | 221.326 |
| 2020-07-24-12:15:02 | 0.608 | 153.465 | 97.974 | 138.677 | 221.284 |
| 2020-07-24-12:15:08 | 0.432 | 153.523 | 97.948 | 138.731 | 221.385 |
| 2020-07-24-12:15:13 | 0.389 | 153.539 | 97.862 | 138.681 | 221.338 |
| 2020-07-24-12:15:19 | 0.342 | 153.496 | 97.879 | 138.766 | 221.395 |
| 2020-07-24-12:15:25 | 0.335 | 153.462 | 97.955 | 138.686 | 221.356 |
| 2020-07-24-12:15:30 | 0.432 | 153.493 | 97.956 | 139.884 | 225.638 |
| 2020-07-24-12:15:36 | 0.372 | 153.457 | 97.979 | 138.696 | 221.335 |
| 2020-07-24-12:15:42 | 0.403 | 153.42 | 97.922 | 138.639 | 221.391 |
| 2020-07-24-12:15:47 | 0.405 | 153.477 | 98.019 | 138.725 | 221.302 |
| 2020-07-24-12:15:53 | 0.451 | 153.502 | 97.954 | 138.719 | 221.424 |
| 2020-07-24-12:15:58 | 0.334 | 153.583 | 97.972 | 138.626 | 221.355 |
| 2020-07-24-12:16:04 | 0.362 | 153.484 | 97.995 | 138.673 | 221.502 |
| 2020-07-24-12:16:10 | 2.638 | 153.463 | 97.977 | 138.715 | 221.416 |
| 2020-07-24-12:16:15 | 0.376 | 153.443 | 97.944 | 138.631 | 221.348 |
| 2020-07-24-12:16:21 | 0.345 | 153.466 | 97.951 | 138.753 | 221.341 |
| 2020-07-24-12:16:27 | 0.417 | 153.577 | 97.921 | 138.758 | 221.285 |
| 2020-07-24-12:16:32 | 0.379 | 153.494 | 98.365 | 138.727 | 221.335 |
| 2020-07-24-12:16:38 | 0.357 | 153.597 | 97.938 | 138.742 | 221.399 |
| 2020-07-24-12:16:43 | 0.358 | 153.499 | 98.034 | 138.868 | 221.332 |
| 2020-07-24-12:16:49 | 0.401 | 153.521 | 97.903 | 138.686 | 221.374 |
| 2020-07-24-12:16:55 | 0.31 | 153.456 | 97.903 | 138.692 | 221.423 |
| 2020-07-24-12:17:00 | 0.319 | 153.45 | 98.031 | 138.714 | 221.359 |
| 2020-07-24-12:17:06 | 0.348 | 153.507 | 98.078 | 138.688 | 221.57 |
| 2020-07-24-12:17:12 | 0.35 | 153.512 | 97.944 | 138.655 | 221.297 |
| 2020-07-24-12:17:17 | 0.434 | 153.465 | 97.922 | 138.705 | 221.378 |
| 2020-07-24-12:17:23 | 0.378 | 154.54 | 97.926 | 138.748 | 221.433 |
| 2020-07-24-12:17:28 | 0.439 | 153.426 | 97.986 | 138.77 | 221.418 |
| 2020-07-24-12:17:34 | 0.364 | 153.479 | 98.065 | 138.706 | 221.387 |
| 2020-07-24-12:17:40 | 0.387 | 153.454 | 97.905 | 138.687 | 221.439 |
| 2020-07-24-12:17:45 | 0.34 | 153.398 | 98.003 | 138.741 | 221.341 |
| 2020-07-24-12:17:51 | 0.425 | 153.502 | 97.997 | 138.698 | 221.314 |
| 2020-07-24-12:17:57 | 0.397 | 153.403 | 97.988 | 138.664 | 221.327 |